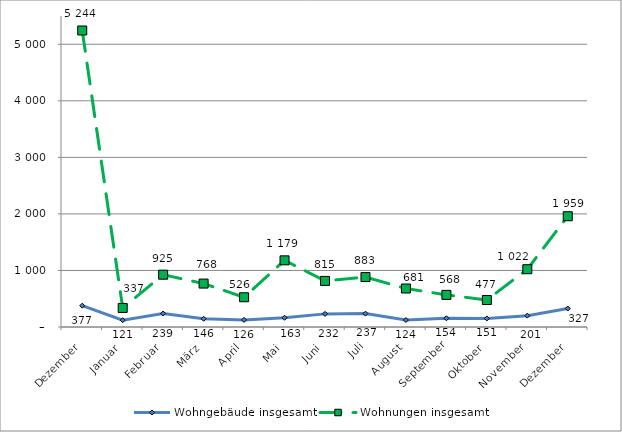
| Category | Wohngebäude insgesamt | Wohnungen insgesamt |
|---|---|---|
| Dezember | 377 | 5244 |
| Januar | 121 | 337 |
| Februar | 239 | 925 |
| März | 146 | 768 |
| April | 126 | 526 |
| Mai | 163 | 1179 |
| Juni | 232 | 815 |
| Juli | 237 | 883 |
| August | 124 | 681 |
| September | 154 | 568 |
| Oktober | 151 | 477 |
| November | 201 | 1022 |
| Dezember | 327 | 1959 |